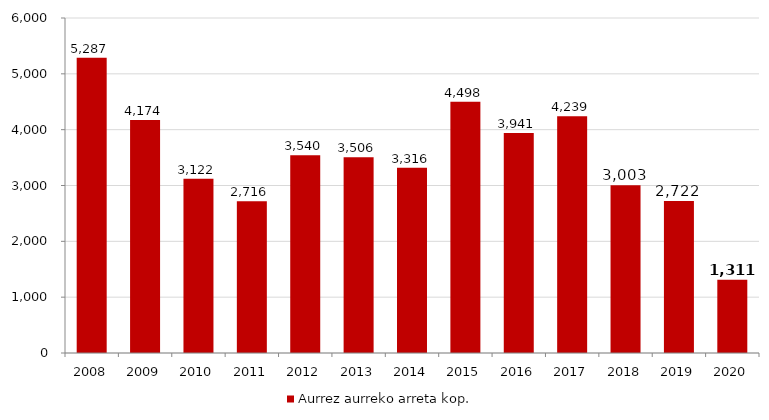
| Category | Aurrez aurreko arreta kop. |
|---|---|
| 2008.0 | 5287 |
| 2009.0 | 4174 |
| 2010.0 | 3122 |
| 2011.0 | 2716 |
| 2012.0 | 3540 |
| 2013.0 | 3506 |
| 2014.0 | 3316 |
| 2015.0 | 4498 |
| 2016.0 | 3941 |
| 2017.0 | 4239 |
| 2018.0 | 3003 |
| 2019.0 | 2722 |
| 2020.0 | 1311 |